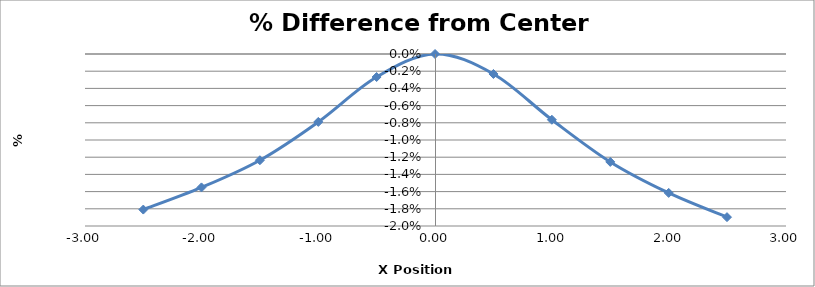
| Category | Series 0 |
|---|---|
| -2.5010000000000003 | -0.018 |
| -2.003 | -0.016 |
| -1.5030000000000001 | -0.012 |
| -1.0030000000000001 | -0.008 |
| -0.5040000000000004 | -0.003 |
| -0.004000000000000448 | 0 |
| 0.49599999999999955 | -0.002 |
| 0.9959999999999996 | -0.008 |
| 1.4959999999999996 | -0.013 |
| 1.9959999999999996 | -0.016 |
| 2.495 | -0.019 |